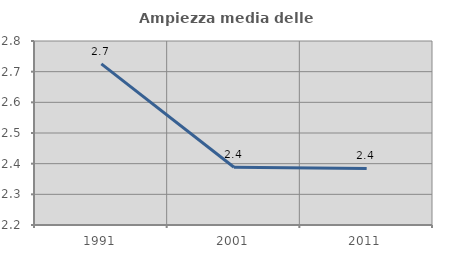
| Category | Ampiezza media delle famiglie |
|---|---|
| 1991.0 | 2.725 |
| 2001.0 | 2.388 |
| 2011.0 | 2.385 |